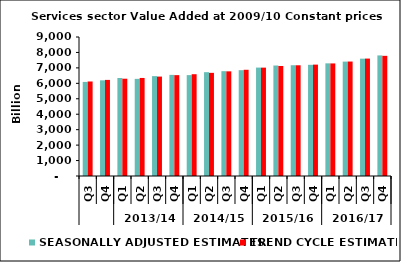
| Category | SEASONALLY ADJUSTED ESTIMATES | TREND CYCLE ESTIMATES |
|---|---|---|
| 0 | 6090.964 | 6120.32 |
| 1 | 6194.78 | 6222.257 |
| 2 | 6345.811 | 6299.496 |
| 3 | 6289.671 | 6348.172 |
| 4 | 6466.773 | 6437.164 |
| 5 | 6547.277 | 6530.618 |
| 6 | 6531.703 | 6589.892 |
| 7 | 6722.919 | 6679.019 |
| 8 | 6785.859 | 6775.646 |
| 9 | 6851.184 | 6877.825 |
| 10 | 7019.947 | 7016.483 |
| 11 | 7153.954 | 7123.585 |
| 12 | 7171.638 | 7169.261 |
| 13 | 7197.982 | 7211.826 |
| 14 | 7293.751 | 7288.59 |
| 15 | 7405.887 | 7411.306 |
| 16 | 7597.204 | 7603.138 |
| 17 | 7807.44 | 7780.499 |